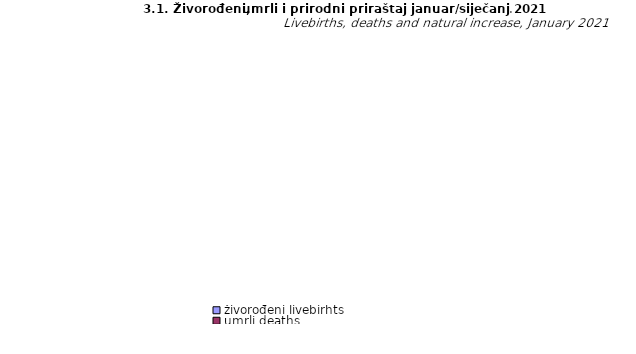
| Category | živorođeni livebirhts | umrli deaths | prirodni priraštaj natural increase |
|---|---|---|---|
| Unsko - sanski | 67 | 161 | -94 |
| Kanton Posavski | 2 | 24 | -22 |
| Tuzlanski | 125 | 374 | -249 |
| Zeničko - dobojski | 177 | 304 | -127 |
| Bosansko - podrinjski | 17 | 29 | -12 |
| Srednjobosanski | 90 | 167 | -77 |
| Hercegovačko-neretvanski | 121 | 192 | -71 |
| Zapadnohercegovački | 29 | 82 | -53 |
| Kanton Sarajevo | 252 | 280 | -28 |
| Kanton 10 | 18 | 50 | -32 |